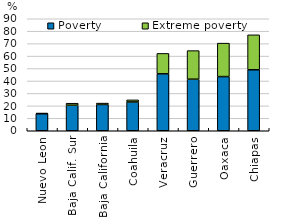
| Category | Poverty | Extreme poverty |
|---|---|---|
| Nuevo Leon | 13.638 | 0.608 |
| Baja Calif. Sur | 20.518 | 1.608 |
| Baja California | 21.115 | 1.118 |
| Coahuila | 23.162 | 1.653 |
| Veracruz | 45.757 | 16.403 |
| Guerrero | 41.446 | 22.962 |
| Oaxaca | 43.521 | 26.88 |
| Chiapas | 49.002 | 28.079 |